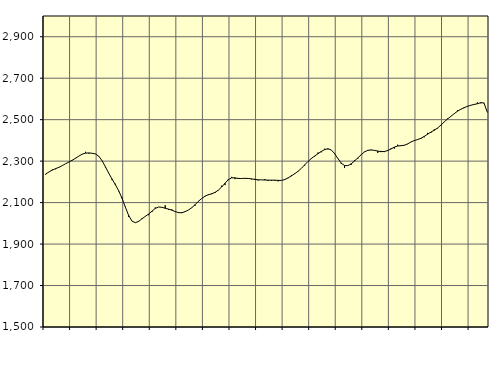
| Category | Piggar | Series 1 |
|---|---|---|
| nan | 2235.2 | 2238.07 |
| 87.0 | 2248 | 2247.77 |
| 87.0 | 2258.7 | 2256.79 |
| 87.0 | 2261.1 | 2263.73 |
| nan | 2269.2 | 2270.29 |
| 88.0 | 2278.3 | 2278.61 |
| 88.0 | 2286.8 | 2287.31 |
| 88.0 | 2295.1 | 2295.56 |
| nan | 2302.8 | 2304.44 |
| 89.0 | 2315.4 | 2313.88 |
| 89.0 | 2324.6 | 2324.27 |
| 89.0 | 2334.2 | 2333.53 |
| nan | 2344.9 | 2338.76 |
| 90.0 | 2336.5 | 2339.51 |
| 90.0 | 2337.7 | 2338.01 |
| 90.0 | 2334.8 | 2334.57 |
| nan | 2324.6 | 2323.56 |
| 91.0 | 2302.7 | 2301.9 |
| 91.0 | 2269.9 | 2272.43 |
| 91.0 | 2240.9 | 2241.71 |
| nan | 2208.5 | 2213.39 |
| 92.0 | 2190.7 | 2186.06 |
| 92.0 | 2154.6 | 2156.76 |
| 92.0 | 2125.3 | 2120.67 |
| nan | 2079.9 | 2078.05 |
| 93.0 | 2031 | 2037.69 |
| 93.0 | 2010.7 | 2010.76 |
| 93.0 | 2003.6 | 2002.97 |
| nan | 2011.4 | 2009.57 |
| 94.0 | 2024.1 | 2021.88 |
| 94.0 | 2034.2 | 2033.52 |
| 94.0 | 2039.3 | 2044.78 |
| nan | 2054.3 | 2058.54 |
| 95.0 | 2076.3 | 2071.97 |
| 95.0 | 2078.9 | 2078.75 |
| 95.0 | 2077.3 | 2077.29 |
| nan | 2086.9 | 2072.66 |
| 96.0 | 2065.4 | 2068.48 |
| 96.0 | 2067 | 2063.51 |
| 96.0 | 2057.8 | 2056.82 |
| nan | 2049.8 | 2051.5 |
| 97.0 | 2049.3 | 2051.26 |
| 97.0 | 2058.5 | 2056.44 |
| 97.0 | 2064.6 | 2064.35 |
| nan | 2074.3 | 2075.24 |
| 98.0 | 2085 | 2090.03 |
| 98.0 | 2108 | 2106.24 |
| 98.0 | 2119.9 | 2119.99 |
| nan | 2132.3 | 2130.99 |
| 99.0 | 2140.6 | 2137.99 |
| 99.0 | 2140.8 | 2142.72 |
| 99.0 | 2146.2 | 2149.23 |
| nan | 2158.8 | 2160.11 |
| 0.0 | 2181.5 | 2175.11 |
| 0.0 | 2184.5 | 2193.18 |
| 0.0 | 2213.5 | 2210.47 |
| nan | 2224 | 2219.69 |
| 1.0 | 2213.5 | 2219.41 |
| 1.0 | 2219 | 2216.24 |
| 1.0 | 2216.7 | 2216.34 |
| nan | 2218.3 | 2217.19 |
| 2.0 | 2217.2 | 2216.32 |
| 2.0 | 2212.2 | 2214.56 |
| 2.0 | 2214.5 | 2211.74 |
| nan | 2206.9 | 2209.84 |
| 3.0 | 2210.1 | 2209.61 |
| 3.0 | 2213 | 2208.93 |
| 3.0 | 2204.3 | 2208.23 |
| nan | 2205.4 | 2208.25 |
| 4.0 | 2205.4 | 2208.12 |
| 4.0 | 2202.5 | 2207.12 |
| 4.0 | 2206.9 | 2206.9 |
| nan | 2213.6 | 2211.21 |
| 5.0 | 2217.8 | 2219.19 |
| 5.0 | 2232.2 | 2228.64 |
| 5.0 | 2240.9 | 2239.33 |
| nan | 2252.1 | 2251.02 |
| 6.0 | 2265 | 2265.19 |
| 6.0 | 2278.8 | 2282.04 |
| 6.0 | 2298.2 | 2298.35 |
| nan | 2311 | 2312.62 |
| 7.0 | 2322.2 | 2324.66 |
| 7.0 | 2341.2 | 2335.86 |
| 7.0 | 2342.8 | 2346.71 |
| nan | 2359.7 | 2355.52 |
| 8.0 | 2357.1 | 2359.75 |
| 8.0 | 2354.1 | 2354.13 |
| 8.0 | 2339.2 | 2336.35 |
| nan | 2311.8 | 2312.71 |
| 9.0 | 2287.5 | 2290.52 |
| 9.0 | 2266.7 | 2278.63 |
| 9.0 | 2278.2 | 2278.28 |
| nan | 2282.3 | 2287.14 |
| 10.0 | 2305 | 2300.58 |
| 10.0 | 2312.3 | 2315.52 |
| 10.0 | 2330.4 | 2330.89 |
| nan | 2345.2 | 2344.21 |
| 11.0 | 2354 | 2352.03 |
| 11.0 | 2355.2 | 2353.64 |
| 11.0 | 2351.3 | 2351.99 |
| nan | 2340.1 | 2348.71 |
| 12.0 | 2349.4 | 2345.75 |
| 12.0 | 2343.6 | 2346.48 |
| 12.0 | 2352.7 | 2351.11 |
| nan | 2361.9 | 2358.79 |
| 13.0 | 2360.7 | 2367.5 |
| 13.0 | 2379.2 | 2372.91 |
| 13.0 | 2375.5 | 2374.61 |
| nan | 2375 | 2376.63 |
| 14.0 | 2381.9 | 2383.09 |
| 14.0 | 2392.9 | 2392.26 |
| 14.0 | 2398.2 | 2399.23 |
| nan | 2404.9 | 2403.98 |
| 15.0 | 2407.2 | 2410.06 |
| 15.0 | 2415.1 | 2419.28 |
| 15.0 | 2436.2 | 2429.86 |
| nan | 2436.1 | 2439.89 |
| 16.0 | 2453.4 | 2448.78 |
| 16.0 | 2457.8 | 2459.62 |
| 16.0 | 2471.3 | 2473.54 |
| nan | 2488.6 | 2488.93 |
| 17.0 | 2505.1 | 2503.17 |
| 17.0 | 2515.2 | 2515.87 |
| 17.0 | 2528.3 | 2528.5 |
| nan | 2544.2 | 2540.65 |
| 18.0 | 2548.5 | 2550.2 |
| 18.0 | 2555.6 | 2557.73 |
| 18.0 | 2563.3 | 2564.26 |
| nan | 2570.1 | 2569.42 |
| 19.0 | 2573.2 | 2573.26 |
| 19.0 | 2582.9 | 2576.75 |
| 19.0 | 2579.1 | 2582.16 |
| nan | 2581.2 | 2580.19 |
| 20.0 | 2534.6 | 2535.13 |